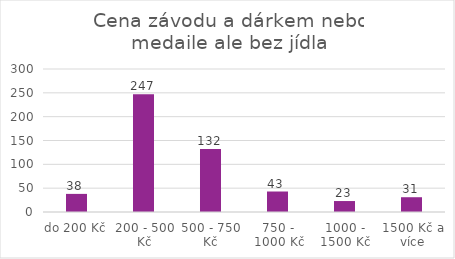
| Category | Series 0 |
|---|---|
| do 200 Kč | 38 |
| 200 - 500 Kč | 247 |
| 500 - 750 Kč | 132 |
| 750 - 1000 Kč | 43 |
| 1000 - 1500 Kč | 23 |
| 1500 Kč a více | 31 |